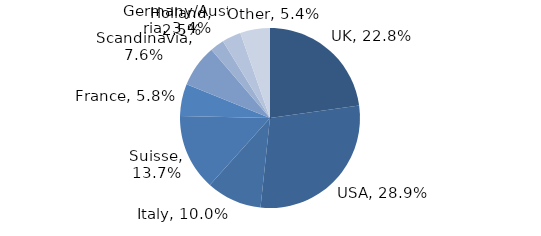
| Category | Investment Style |
|---|---|
| UK | 0.228 |
| USA | 0.289 |
| Italy | 0.1 |
| Suisse | 0.137 |
| France | 0.058 |
| Scandinavia | 0.076 |
| Holland | 0.025 |
| Germany/Austria | 0.034 |
| Other | 0.054 |